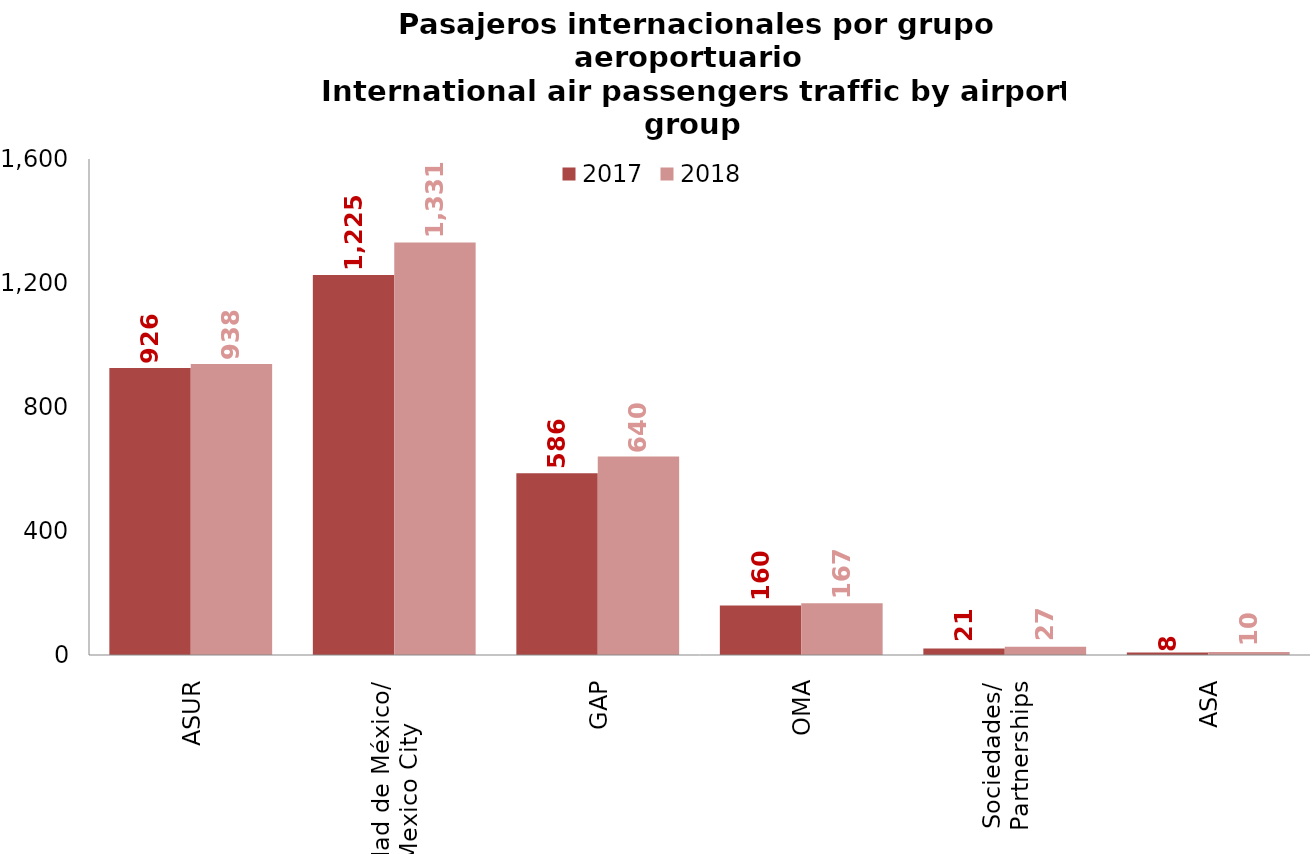
| Category | 2017 | 2018 |
|---|---|---|
| ASUR | 925.784 | 938.351 |
| Ciudad de México/
Mexico City | 1225.48 | 1330.829 |
| GAP | 586.027 | 639.934 |
| OMA | 159.782 | 167.036 |
| Sociedades/
Partnerships | 21.192 | 26.705 |
| ASA | 7.768 | 9.849 |